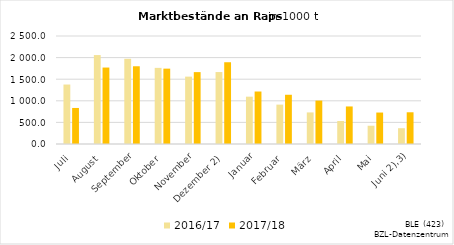
| Category | 2016/17 | 2017/18 |
|---|---|---|
| Juli | 1376.535 | 834.219 |
| August | 2058.638 | 1769.705 |
| September | 1972.355 | 1799.387 |
| Oktober | 1762.107 | 1744.317 |
| November | 1559.442 | 1663.865 |
|  Dezember 2) | 1665.246 | 1892.692 |
| Januar | 1095.452 | 1214.967 |
| Februar | 911.422 | 1139.627 |
| März | 730.929 | 1005.107 |
| April | 532.031 | 869.096 |
| Mai | 422.687 | 728.22 |
|    Juni 2),3) | 365.668 | 734.117 |